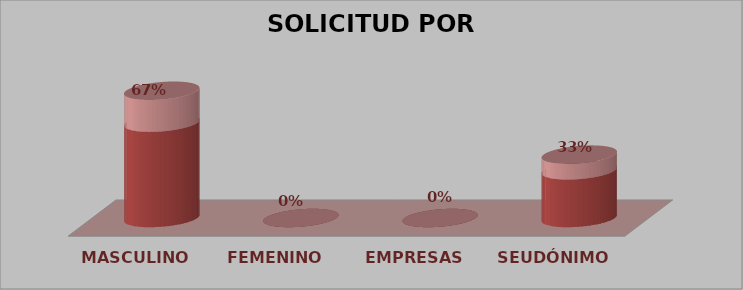
| Category | SOLICITUD POR GÉNERO | Series 1 |
|---|---|---|
| MASCULINO | 2 | 0.67 |
| FEMENINO | 0 | 0 |
| EMPRESAS | 0 | 0 |
| SEUDÓNIMO | 1 | 0.33 |